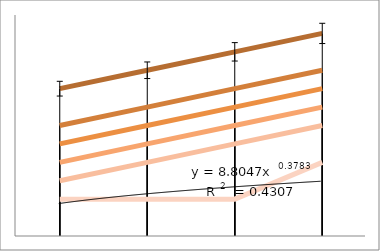
| Category | Series 1 | Series 2 | Series 3 | Series 4 | Series 5 | Series 6 |
|---|---|---|---|---|---|---|
| Point 1 | 40 | 30 | 25 | 20 | 15 | 10 |
| Point 2 | 45 | 35 | 30 | 25 | 20 | 10 |
| Point 3 | 50 | 40 | 35 | 30 | 25 | 10 |
| Point 4 | 55 | 45 | 40 | 35 | 30 | 20 |